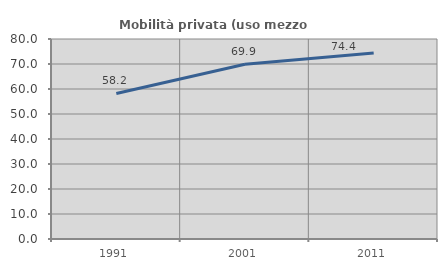
| Category | Mobilità privata (uso mezzo privato) |
|---|---|
| 1991.0 | 58.231 |
| 2001.0 | 69.9 |
| 2011.0 | 74.38 |